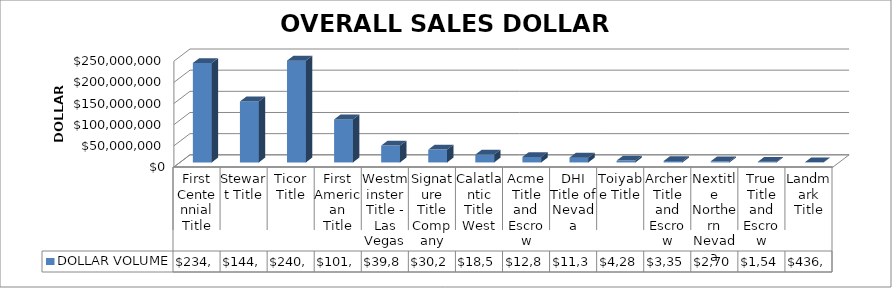
| Category | DOLLAR VOLUME |
|---|---|
| First Centennial Title | 234887581.79 |
| Stewart Title | 144129779 |
| Ticor Title | 240518618.79 |
| First American Title | 101623843.77 |
| Westminster Title - Las Vegas | 39814631 |
| Signature Title Company | 30285800 |
| Calatlantic Title West | 18543136 |
| Acme Title and Escrow | 12817925 |
| DHI Title of Nevada | 11339490 |
| Toiyabe Title | 4282900 |
| Archer Title and Escrow | 3357000 |
| Nextitle Northern Nevada | 2702000 |
| True Title and Escrow | 1543500 |
| Landmark Title | 436000 |